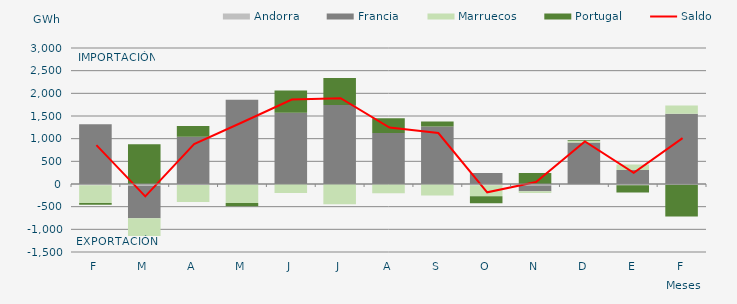
| Category | Andorra | Francia | Marruecos | Portugal |
|---|---|---|---|---|
| F | -25.31 | 1316.02 | -393.308 | -40.299 |
| M | -38.757 | -716.099 | -394.27 | 875.503 |
| A | -19.567 | 1043.23 | -378.646 | 237.582 |
| M | -12.003 | 1858.226 | -405.06 | -72.803 |
| J | -0.136 | 1569.713 | -200.627 | 495.014 |
| J | -0.226 | 1742.725 | -445.987 | 597.215 |
| A | -4.615 | 1125.357 | -201.623 | 324.903 |
| S | -3.339 | 1270.11 | -251.758 | 109.449 |
| O | -26.446 | 240.099 | -243.372 | -152.75 |
| N | -30.553 | -129.248 | -36.387 | 240.868 |
| D | -24.685 | 915.885 | 32.032 | 15.954 |
| E | -26.717 | 310.511 | 121.876 | -159.316 |
| F | -15.973 | 1550.723 | 179.304 | -702.278 |